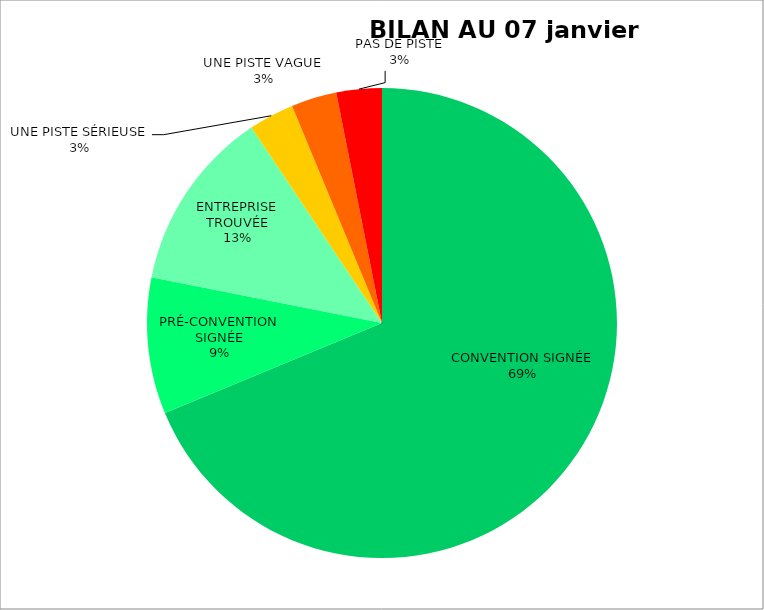
| Category | TOTAL |
|---|---|
| CONVENTION SIGNÉE | 22 |
| PRÉ-CONVENTION SIGNÉE | 3 |
| ENTREPRISE TROUVÉE | 4 |
| UNE PISTE SÉRIEUSE | 1 |
| UNE PISTE VAGUE | 1 |
| PAS DE PISTE | 1 |